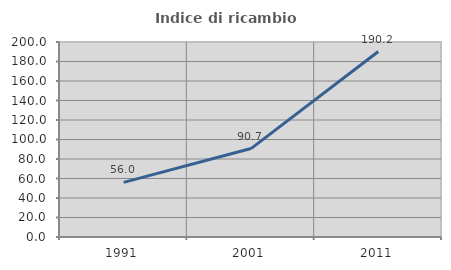
| Category | Indice di ricambio occupazionale  |
|---|---|
| 1991.0 | 56.008 |
| 2001.0 | 90.698 |
| 2011.0 | 190.237 |